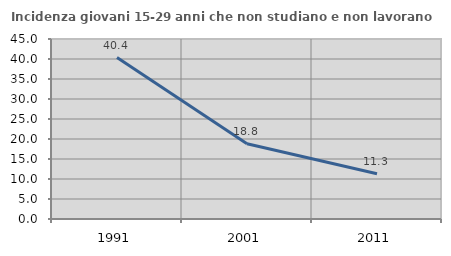
| Category | Incidenza giovani 15-29 anni che non studiano e non lavorano  |
|---|---|
| 1991.0 | 40.351 |
| 2001.0 | 18.831 |
| 2011.0 | 11.333 |